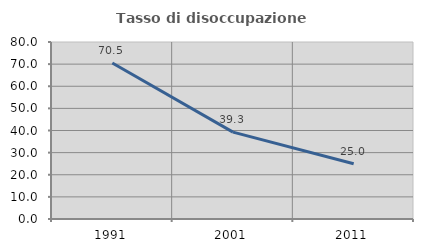
| Category | Tasso di disoccupazione giovanile  |
|---|---|
| 1991.0 | 70.476 |
| 2001.0 | 39.286 |
| 2011.0 | 25 |